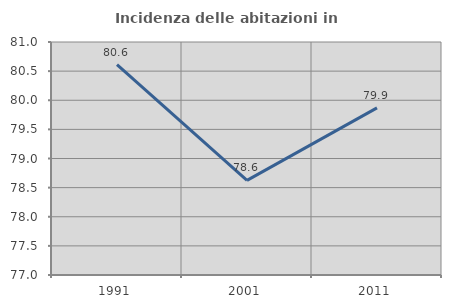
| Category | Incidenza delle abitazioni in proprietà  |
|---|---|
| 1991.0 | 80.612 |
| 2001.0 | 78.625 |
| 2011.0 | 79.87 |